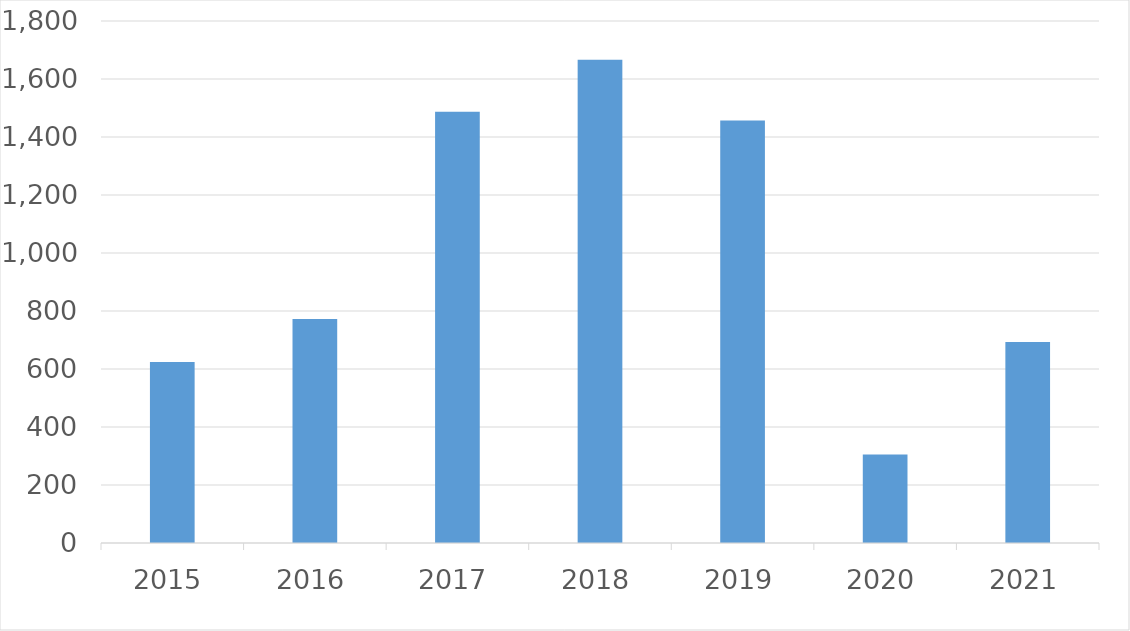
| Category | Series 0 |
|---|---|
| 2015 | 624 |
| 2016 | 772 |
| 2017 | 1487 |
| 2018 | 1666 |
| 2019 | 1457 |
| 2020 | 305 |
| 2021 | 693 |